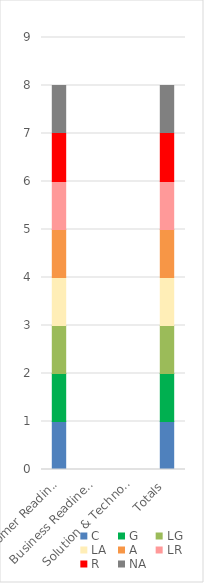
| Category | C | G | LG | LA | A | LR | R | NA |
|---|---|---|---|---|---|---|---|---|
| Customer Readiness | 1 | 1 | 1 | 1 | 1 | 1 | 1 | 1 |
| Business Readiness | 0 | 0 | 0 | 0 | 0 | 0 | 0 | 0 |
| Solution & Technology Readiness | 0 | 0 | 0 | 0 | 0 | 0 | 0 | 0 |
| Totals | 1 | 1 | 1 | 1 | 1 | 1 | 1 | 1 |